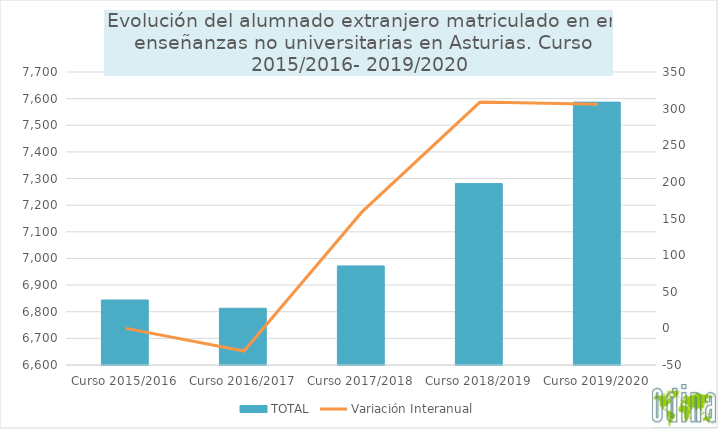
| Category | TOTAL |
|---|---|
| Curso 2015/2016 | 6844 |
| Curso 2016/2017 | 6813 |
| Curso 2017/2018 | 6972 |
| Curso 2018/2019 | 7281 |
| Curso 2019/2020 | 7587 |